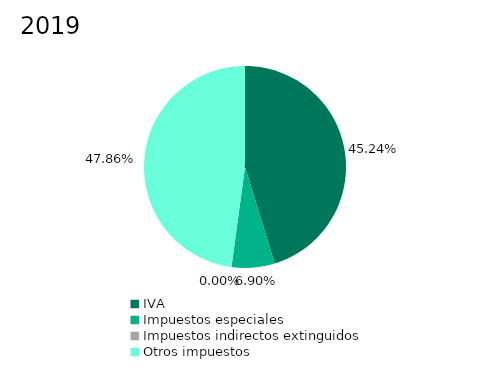
| Category | 2019 |
|---|---|
| IVA | 0.452 |
| Impuestos especiales | 0.069 |
| Impuestos indirectos extinguidos | 0 |
| Otros impuestos | 0.479 |